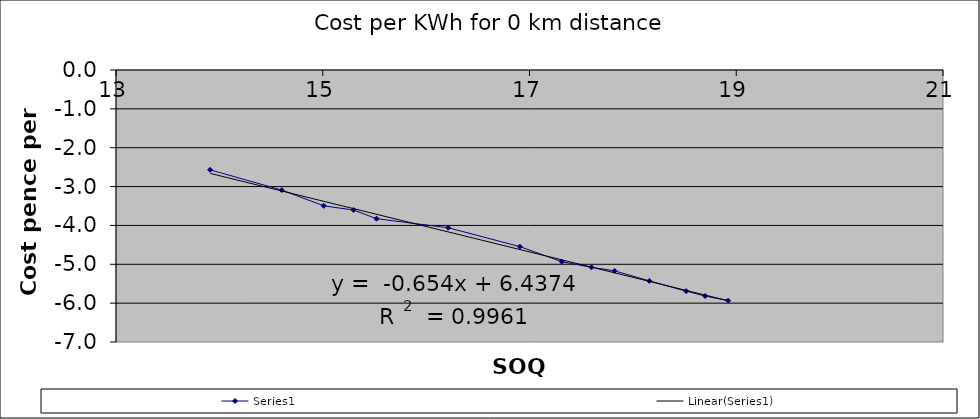
| Category | Series 0 |
|---|---|
| 18.921456031864853 | -5.936 |
| 18.698312480550644 | -5.817 |
| 18.51599092375669 | -5.692 |
| 18.159315979817958 | -5.428 |
| 17.822843743196746 | -5.169 |
| 17.599700191882537 | -5.078 |
| 17.312018119430753 | -4.934 |
| 16.90655301132259 | -4.545 |
| 16.213405830762646 | -4.059 |
| 15.520258650202699 | -3.827 |
| 15.29711509888849 | -3.604 |
| 15.009433026436708 | -3.496 |
| 14.603967918328545 | -3.09 |
| 13.9108207377686 | -2.569 |